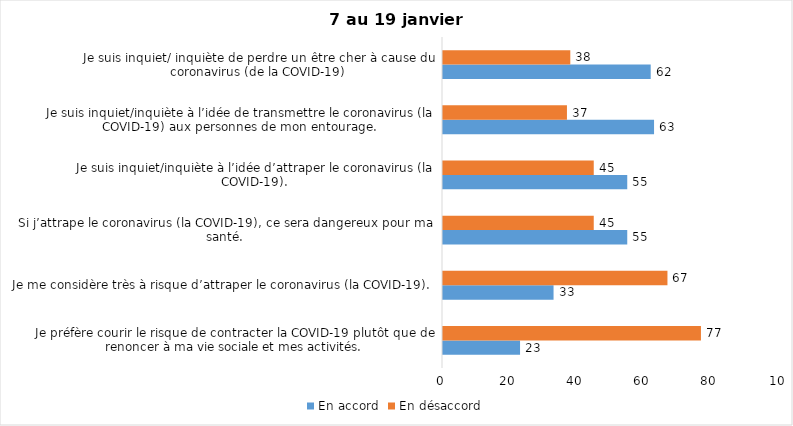
| Category | En accord | En désaccord |
|---|---|---|
| Je préfère courir le risque de contracter la COVID-19 plutôt que de renoncer à ma vie sociale et mes activités. | 23 | 77 |
| Je me considère très à risque d’attraper le coronavirus (la COVID-19). | 33 | 67 |
| Si j’attrape le coronavirus (la COVID-19), ce sera dangereux pour ma santé. | 55 | 45 |
| Je suis inquiet/inquiète à l’idée d’attraper le coronavirus (la COVID-19). | 55 | 45 |
| Je suis inquiet/inquiète à l’idée de transmettre le coronavirus (la COVID-19) aux personnes de mon entourage. | 63 | 37 |
| Je suis inquiet/ inquiète de perdre un être cher à cause du coronavirus (de la COVID-19) | 62 | 38 |